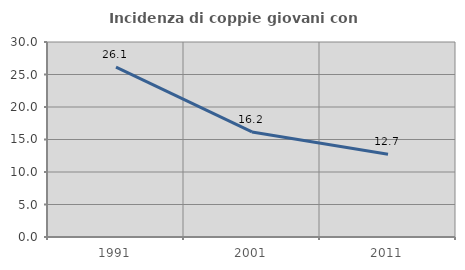
| Category | Incidenza di coppie giovani con figli |
|---|---|
| 1991.0 | 26.129 |
| 2001.0 | 16.165 |
| 2011.0 | 12.727 |